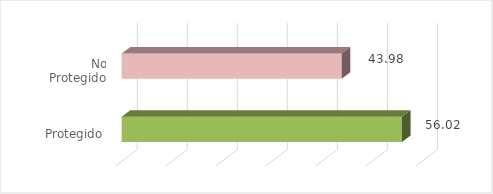
| Category | Series 0 |
|---|---|
| Protegido | 56.021 |
| No Protegido | 43.979 |